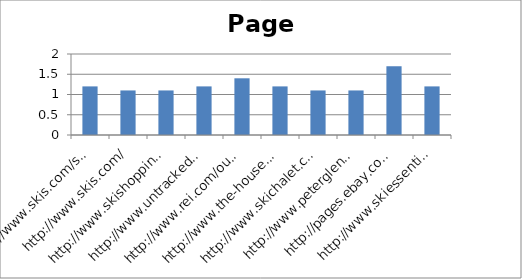
| Category | mT/mR |
|---|---|
| http://www.skis.com/ski-equipment/c9/ | 1.2 |
| http://www.skis.com/ | 1.1 |
| http://www.skishoppingguide.com/ | 1.1 |
| http://www.untracked.com/ | 1.2 |
| http://www.rei.com/outlet/category/22000078 | 1.4 |
| http://www.the-house.com/skis.html | 1.2 |
| http://www.skichalet.com/ | 1.1 |
| http://www.peterglenn.com/ | 1.1 |
| http://pages.ebay.com/buy/guides/skis-skiing-equipment-buying-guide/ | 1.7 |
| http://www.skiessentials.com/ | 1.2 |